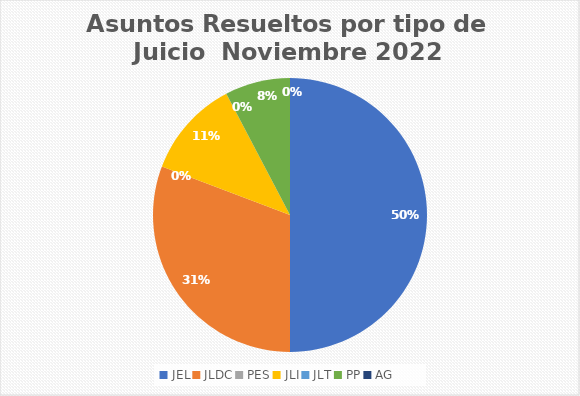
| Category | Asuntos Resueltos por tipo de Juicio  Noviembre |
|---|---|
| JEL | 13 |
| JLDC | 8 |
| PES | 0 |
| JLI | 3 |
| JLT | 0 |
| PP | 2 |
| AG | 0 |